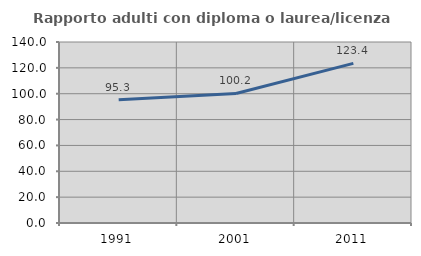
| Category | Rapporto adulti con diploma o laurea/licenza media  |
|---|---|
| 1991.0 | 95.265 |
| 2001.0 | 100.167 |
| 2011.0 | 123.435 |